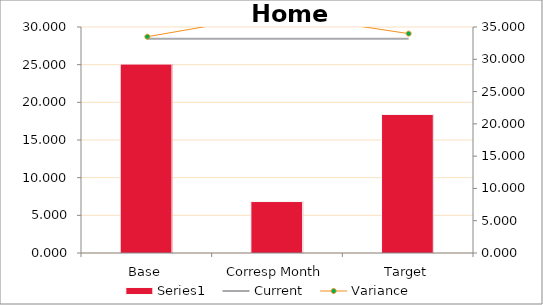
| Category | Series 0 |
|---|---|
| Base | 25.082 |
| Corresp Month | 6.832 |
| Target | 18.393 |